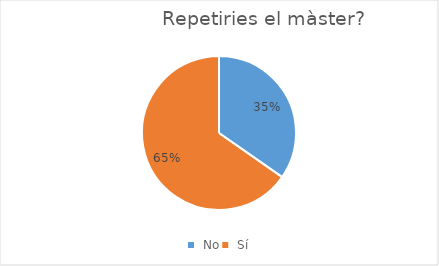
| Category | Series 0 |
|---|---|
|  No | 17 |
|  Sí | 32 |